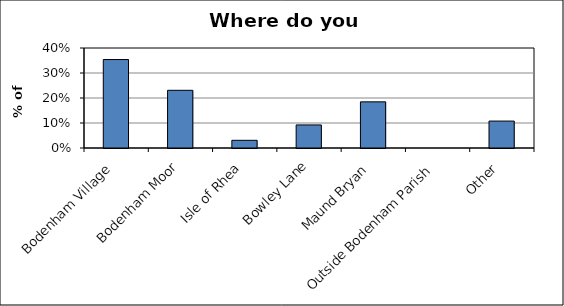
| Category | Series 0 |
|---|---|
| Bodenham Village | 0.354 |
| Bodenham Moor | 0.231 |
| Isle of Rhea | 0.031 |
| Bowley Lane | 0.092 |
| Maund Bryan | 0.185 |
| Outside Bodenham Parish | 0 |
| Other | 0.108 |